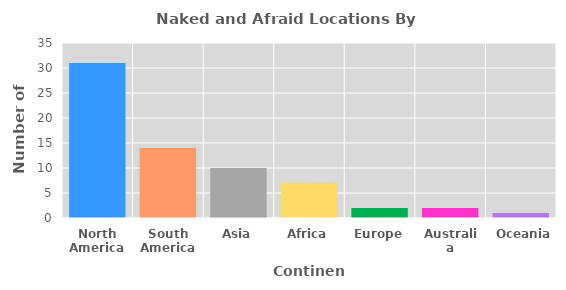
| Category | Count |
|---|---|
| North America | 31 |
| South America | 14 |
| Asia | 10 |
| Africa | 7 |
| Europe | 2 |
| Australia | 2 |
| Oceania | 1 |